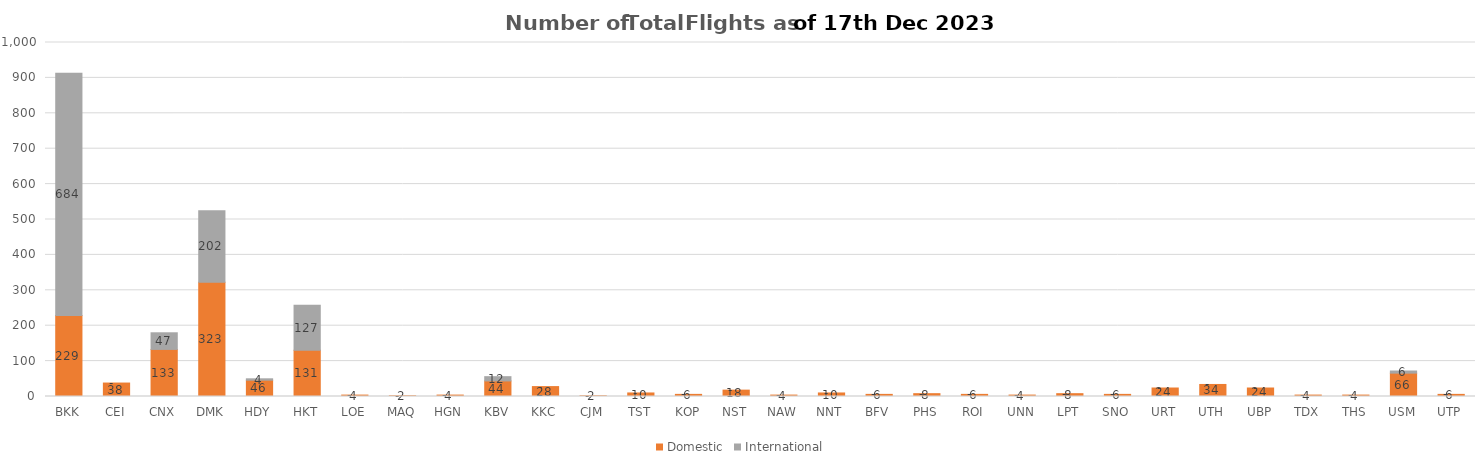
| Category | Domestic | International |
|---|---|---|
| BKK | 229 | 684 |
| CEI | 38 | 0 |
| CNX | 133 | 47 |
| DMK | 323 | 202 |
| HDY | 46 | 4 |
| HKT | 131 | 127 |
| LOE | 4 | 0 |
| MAQ | 2 | 0 |
| HGN | 4 | 0 |
| KBV | 44 | 12 |
| KKC | 28 | 0 |
| CJM | 2 | 0 |
| TST | 10 | 0 |
| KOP | 6 | 0 |
| NST | 18 | 0 |
| NAW | 4 | 0 |
| NNT | 10 | 0 |
| BFV | 6 | 0 |
| PHS | 8 | 0 |
| ROI | 6 | 0 |
| UNN | 4 | 0 |
| LPT | 8 | 0 |
| SNO | 6 | 0 |
| URT | 24 | 0 |
| UTH | 34 | 0 |
| UBP | 24 | 0 |
| TDX | 4 | 0 |
| THS | 4 | 0 |
| USM | 66 | 6 |
| UTP | 6 | 0 |